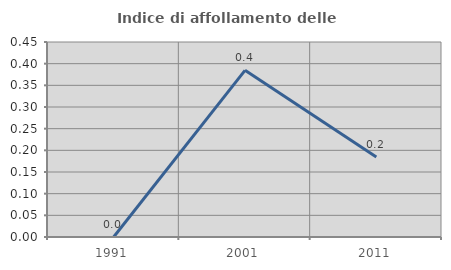
| Category | Indice di affollamento delle abitazioni  |
|---|---|
| 1991.0 | 0 |
| 2001.0 | 0.385 |
| 2011.0 | 0.185 |